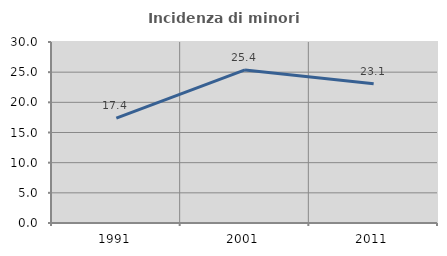
| Category | Incidenza di minori stranieri |
|---|---|
| 1991.0 | 17.391 |
| 2001.0 | 25.373 |
| 2011.0 | 23.077 |